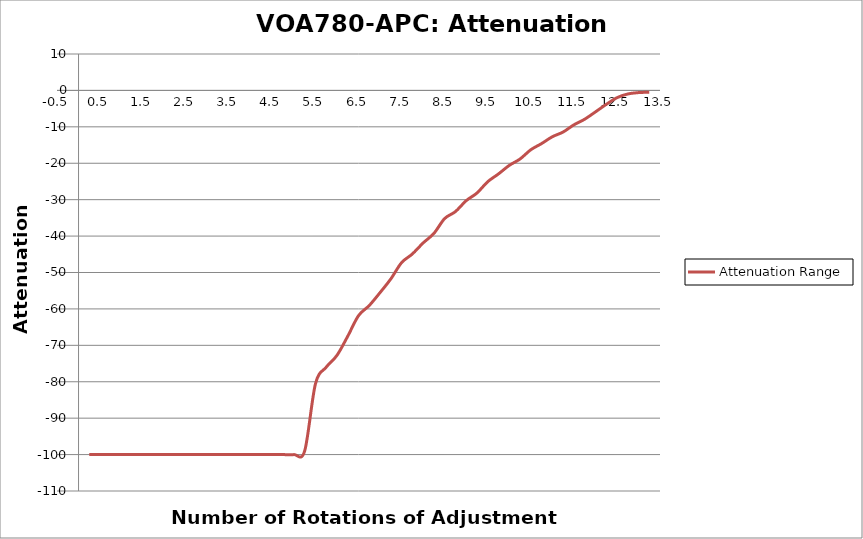
| Category | Attenuation Range |
|---|---|
| 0.25 | -100 |
| 0.5 | -100 |
| 0.75 | -100 |
| 1.0 | -100 |
| 1.25 | -100 |
| 1.5 | -100 |
| 1.75 | -100 |
| 2.0 | -100 |
| 2.25 | -100 |
| 2.5 | -100 |
| 2.75 | -100 |
| 3.0 | -100 |
| 3.25 | -100 |
| 3.5 | -100 |
| 3.75 | -100 |
| 4.0 | -100 |
| 4.25 | -100 |
| 4.5 | -100 |
| 4.75 | -100 |
| 5.0 | -100 |
| 5.25 | -99 |
| 5.5 | -80.6 |
| 5.75 | -76 |
| 6.0 | -72.75 |
| 6.25 | -67.5 |
| 6.5 | -61.86 |
| 6.75 | -59.06 |
| 7.0 | -55.52 |
| 7.25 | -51.77 |
| 7.5 | -47.3 |
| 7.75 | -44.92 |
| 8.0 | -41.89 |
| 8.25 | -39.28 |
| 8.5 | -35.19 |
| 8.75 | -33.28 |
| 9.0 | -30.28 |
| 9.25 | -28.18 |
| 9.5 | -25.07 |
| 9.75 | -22.93 |
| 10.0 | -20.59 |
| 10.25 | -18.84 |
| 10.5 | -16.3 |
| 10.75 | -14.6 |
| 11.0 | -12.72 |
| 11.25 | -11.43 |
| 11.5 | -9.46 |
| 11.75 | -7.92 |
| 12.0 | -5.91 |
| 12.25 | -3.85 |
| 12.5 | -2.01 |
| 12.75 | -0.98 |
| 13.0 | -0.6 |
| 13.25 | -0.5 |